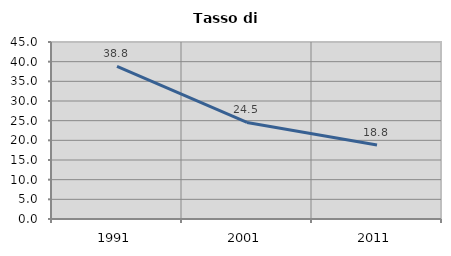
| Category | Tasso di disoccupazione   |
|---|---|
| 1991.0 | 38.774 |
| 2001.0 | 24.546 |
| 2011.0 | 18.791 |